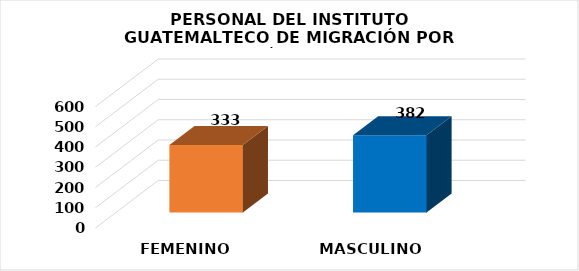
| Category | Series 0 |
|---|---|
| FEMENINO | 333 |
| MASCULINO | 382 |